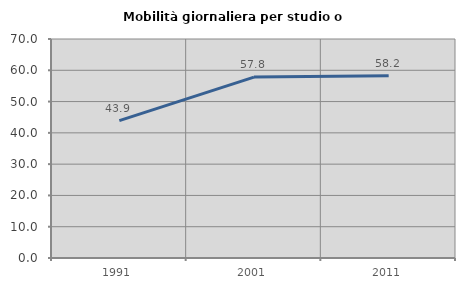
| Category | Mobilità giornaliera per studio o lavoro |
|---|---|
| 1991.0 | 43.911 |
| 2001.0 | 57.836 |
| 2011.0 | 58.242 |